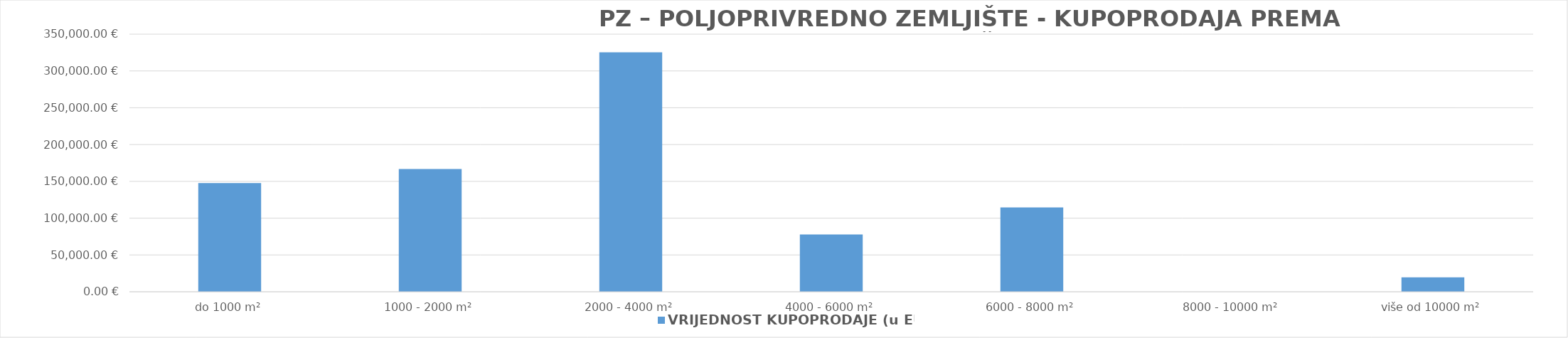
| Category | VRIJEDNOST KUPOPRODAJE (u EUR) |
|---|---|
| do 1000 m² | 147735.158 |
| 1000 - 2000 m² | 166784.155 |
| 2000 - 4000 m² | 325316.675 |
| 4000 - 6000 m² | 77951.381 |
| 6000 - 8000 m² | 114592.968 |
| 8000 - 10000 m² | 0 |
| više od 10000 m² | 19672.585 |